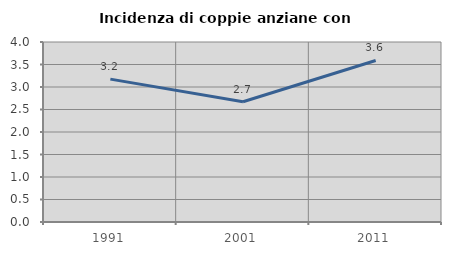
| Category | Incidenza di coppie anziane con figli |
|---|---|
| 1991.0 | 3.175 |
| 2001.0 | 2.672 |
| 2011.0 | 3.59 |